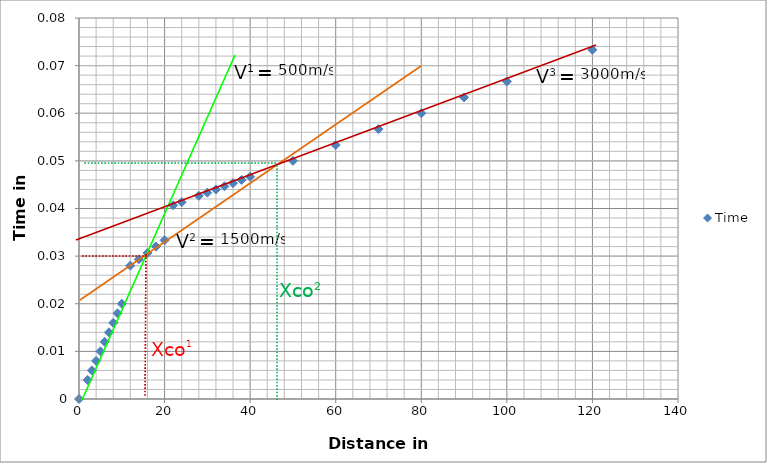
| Category | Time |
|---|---|
| 0.0 | 0 |
| 2.0 | 0.004 |
| 3.0 | 0.006 |
| 4.0 | 0.008 |
| 5.0 | 0.01 |
| 6.0 | 0.012 |
| 7.0 | 0.014 |
| 8.0 | 0.016 |
| 9.0 | 0.018 |
| 10.0 | 0.02 |
| 12.0 | 0.028 |
| 14.0 | 0.029 |
| 16.0 | 0.031 |
| 18.0 | 0.032 |
| 20.0 | 0.033 |
| 22.0 | 0.041 |
| 24.0 | 0.041 |
| 28.0 | 0.043 |
| 30.0 | 0.043 |
| 32.0 | 0.044 |
| 34.0 | 0.045 |
| 36.0 | 0.045 |
| 38.0 | 0.046 |
| 40.0 | 0.047 |
| 50.0 | 0.05 |
| 60.0 | 0.053 |
| 70.0 | 0.057 |
| 80.0 | 0.06 |
| 90.0 | 0.063 |
| 100.0 | 0.067 |
| 120.0 | 0.073 |